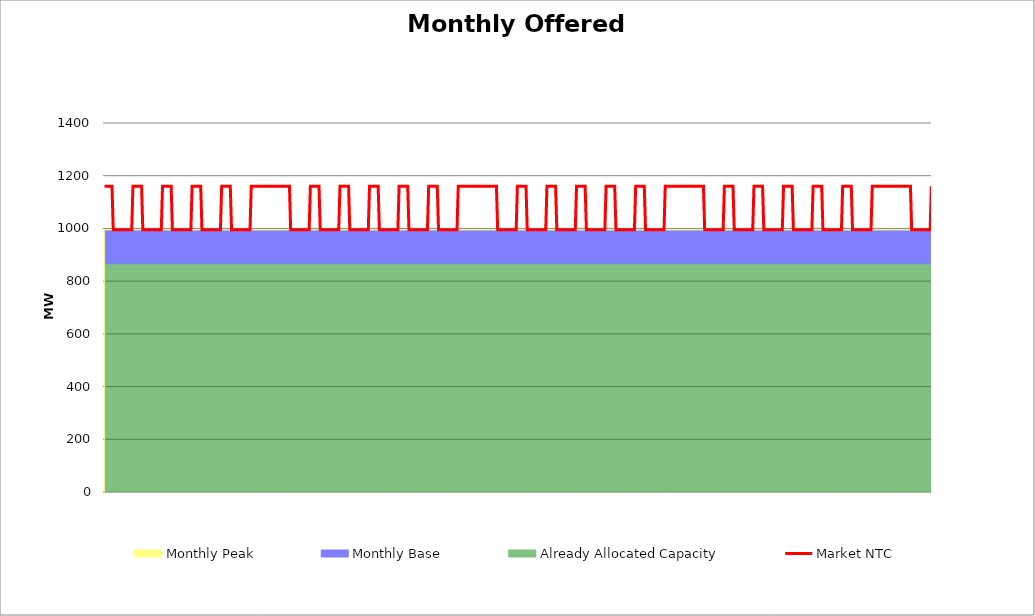
| Category | Market NTC |
|---|---|
| 0 | 1160 |
| 1 | 1160 |
| 2 | 1160 |
| 3 | 1160 |
| 4 | 1160 |
| 5 | 1160 |
| 6 | 1160 |
| 7 | 995 |
| 8 | 995 |
| 9 | 995 |
| 10 | 995 |
| 11 | 995 |
| 12 | 995 |
| 13 | 995 |
| 14 | 995 |
| 15 | 995 |
| 16 | 995 |
| 17 | 995 |
| 18 | 995 |
| 19 | 995 |
| 20 | 995 |
| 21 | 995 |
| 22 | 995 |
| 23 | 1160 |
| 24 | 1160 |
| 25 | 1160 |
| 26 | 1160 |
| 27 | 1160 |
| 28 | 1160 |
| 29 | 1160 |
| 30 | 1160 |
| 31 | 995 |
| 32 | 995 |
| 33 | 995 |
| 34 | 995 |
| 35 | 995 |
| 36 | 995 |
| 37 | 995 |
| 38 | 995 |
| 39 | 995 |
| 40 | 995 |
| 41 | 995 |
| 42 | 995 |
| 43 | 995 |
| 44 | 995 |
| 45 | 995 |
| 46 | 995 |
| 47 | 1160 |
| 48 | 1160 |
| 49 | 1160 |
| 50 | 1160 |
| 51 | 1160 |
| 52 | 1160 |
| 53 | 1160 |
| 54 | 1160 |
| 55 | 995 |
| 56 | 995 |
| 57 | 995 |
| 58 | 995 |
| 59 | 995 |
| 60 | 995 |
| 61 | 995 |
| 62 | 995 |
| 63 | 995 |
| 64 | 995 |
| 65 | 995 |
| 66 | 995 |
| 67 | 995 |
| 68 | 995 |
| 69 | 995 |
| 70 | 995 |
| 71 | 1160 |
| 72 | 1160 |
| 73 | 1160 |
| 74 | 1160 |
| 75 | 1160 |
| 76 | 1160 |
| 77 | 1160 |
| 78 | 1160 |
| 79 | 995 |
| 80 | 995 |
| 81 | 995 |
| 82 | 995 |
| 83 | 995 |
| 84 | 995 |
| 85 | 995 |
| 86 | 995 |
| 87 | 995 |
| 88 | 995 |
| 89 | 995 |
| 90 | 995 |
| 91 | 995 |
| 92 | 995 |
| 93 | 995 |
| 94 | 995 |
| 95 | 1160 |
| 96 | 1160 |
| 97 | 1160 |
| 98 | 1160 |
| 99 | 1160 |
| 100 | 1160 |
| 101 | 1160 |
| 102 | 1160 |
| 103 | 995 |
| 104 | 995 |
| 105 | 995 |
| 106 | 995 |
| 107 | 995 |
| 108 | 995 |
| 109 | 995 |
| 110 | 995 |
| 111 | 995 |
| 112 | 995 |
| 113 | 995 |
| 114 | 995 |
| 115 | 995 |
| 116 | 995 |
| 117 | 995 |
| 118 | 995 |
| 119 | 1160 |
| 120 | 1160 |
| 121 | 1160 |
| 122 | 1160 |
| 123 | 1160 |
| 124 | 1160 |
| 125 | 1160 |
| 126 | 1160 |
| 127 | 1160 |
| 128 | 1160 |
| 129 | 1160 |
| 130 | 1160 |
| 131 | 1160 |
| 132 | 1160 |
| 133 | 1160 |
| 134 | 1160 |
| 135 | 1160 |
| 136 | 1160 |
| 137 | 1160 |
| 138 | 1160 |
| 139 | 1160 |
| 140 | 1160 |
| 141 | 1160 |
| 142 | 1160 |
| 143 | 1160 |
| 144 | 1160 |
| 145 | 1160 |
| 146 | 1160 |
| 147 | 1160 |
| 148 | 1160 |
| 149 | 1160 |
| 150 | 1160 |
| 151 | 995 |
| 152 | 995 |
| 153 | 995 |
| 154 | 995 |
| 155 | 995 |
| 156 | 995 |
| 157 | 995 |
| 158 | 995 |
| 159 | 995 |
| 160 | 995 |
| 161 | 995 |
| 162 | 995 |
| 163 | 995 |
| 164 | 995 |
| 165 | 995 |
| 166 | 995 |
| 167 | 1160 |
| 168 | 1160 |
| 169 | 1160 |
| 170 | 1160 |
| 171 | 1160 |
| 172 | 1160 |
| 173 | 1160 |
| 174 | 1160 |
| 175 | 995 |
| 176 | 995 |
| 177 | 995 |
| 178 | 995 |
| 179 | 995 |
| 180 | 995 |
| 181 | 995 |
| 182 | 995 |
| 183 | 995 |
| 184 | 995 |
| 185 | 995 |
| 186 | 995 |
| 187 | 995 |
| 188 | 995 |
| 189 | 995 |
| 190 | 995 |
| 191 | 1160 |
| 192 | 1160 |
| 193 | 1160 |
| 194 | 1160 |
| 195 | 1160 |
| 196 | 1160 |
| 197 | 1160 |
| 198 | 1160 |
| 199 | 995 |
| 200 | 995 |
| 201 | 995 |
| 202 | 995 |
| 203 | 995 |
| 204 | 995 |
| 205 | 995 |
| 206 | 995 |
| 207 | 995 |
| 208 | 995 |
| 209 | 995 |
| 210 | 995 |
| 211 | 995 |
| 212 | 995 |
| 213 | 995 |
| 214 | 995 |
| 215 | 1160 |
| 216 | 1160 |
| 217 | 1160 |
| 218 | 1160 |
| 219 | 1160 |
| 220 | 1160 |
| 221 | 1160 |
| 222 | 1160 |
| 223 | 995 |
| 224 | 995 |
| 225 | 995 |
| 226 | 995 |
| 227 | 995 |
| 228 | 995 |
| 229 | 995 |
| 230 | 995 |
| 231 | 995 |
| 232 | 995 |
| 233 | 995 |
| 234 | 995 |
| 235 | 995 |
| 236 | 995 |
| 237 | 995 |
| 238 | 995 |
| 239 | 1160 |
| 240 | 1160 |
| 241 | 1160 |
| 242 | 1160 |
| 243 | 1160 |
| 244 | 1160 |
| 245 | 1160 |
| 246 | 1160 |
| 247 | 995 |
| 248 | 995 |
| 249 | 995 |
| 250 | 995 |
| 251 | 995 |
| 252 | 995 |
| 253 | 995 |
| 254 | 995 |
| 255 | 995 |
| 256 | 995 |
| 257 | 995 |
| 258 | 995 |
| 259 | 995 |
| 260 | 995 |
| 261 | 995 |
| 262 | 995 |
| 263 | 1160 |
| 264 | 1160 |
| 265 | 1160 |
| 266 | 1160 |
| 267 | 1160 |
| 268 | 1160 |
| 269 | 1160 |
| 270 | 1160 |
| 271 | 995 |
| 272 | 995 |
| 273 | 995 |
| 274 | 995 |
| 275 | 995 |
| 276 | 995 |
| 277 | 995 |
| 278 | 995 |
| 279 | 995 |
| 280 | 995 |
| 281 | 995 |
| 282 | 995 |
| 283 | 995 |
| 284 | 995 |
| 285 | 995 |
| 286 | 995 |
| 287 | 1160 |
| 288 | 1160 |
| 289 | 1160 |
| 290 | 1160 |
| 291 | 1160 |
| 292 | 1160 |
| 293 | 1160 |
| 294 | 1160 |
| 295 | 1160 |
| 296 | 1160 |
| 297 | 1160 |
| 298 | 1160 |
| 299 | 1160 |
| 300 | 1160 |
| 301 | 1160 |
| 302 | 1160 |
| 303 | 1160 |
| 304 | 1160 |
| 305 | 1160 |
| 306 | 1160 |
| 307 | 1160 |
| 308 | 1160 |
| 309 | 1160 |
| 310 | 1160 |
| 311 | 1160 |
| 312 | 1160 |
| 313 | 1160 |
| 314 | 1160 |
| 315 | 1160 |
| 316 | 1160 |
| 317 | 1160 |
| 318 | 1160 |
| 319 | 995 |
| 320 | 995 |
| 321 | 995 |
| 322 | 995 |
| 323 | 995 |
| 324 | 995 |
| 325 | 995 |
| 326 | 995 |
| 327 | 995 |
| 328 | 995 |
| 329 | 995 |
| 330 | 995 |
| 331 | 995 |
| 332 | 995 |
| 333 | 995 |
| 334 | 995 |
| 335 | 1160 |
| 336 | 1160 |
| 337 | 1160 |
| 338 | 1160 |
| 339 | 1160 |
| 340 | 1160 |
| 341 | 1160 |
| 342 | 1160 |
| 343 | 995 |
| 344 | 995 |
| 345 | 995 |
| 346 | 995 |
| 347 | 995 |
| 348 | 995 |
| 349 | 995 |
| 350 | 995 |
| 351 | 995 |
| 352 | 995 |
| 353 | 995 |
| 354 | 995 |
| 355 | 995 |
| 356 | 995 |
| 357 | 995 |
| 358 | 995 |
| 359 | 1160 |
| 360 | 1160 |
| 361 | 1160 |
| 362 | 1160 |
| 363 | 1160 |
| 364 | 1160 |
| 365 | 1160 |
| 366 | 1160 |
| 367 | 995 |
| 368 | 995 |
| 369 | 995 |
| 370 | 995 |
| 371 | 995 |
| 372 | 995 |
| 373 | 995 |
| 374 | 995 |
| 375 | 995 |
| 376 | 995 |
| 377 | 995 |
| 378 | 995 |
| 379 | 995 |
| 380 | 995 |
| 381 | 995 |
| 382 | 995 |
| 383 | 1160 |
| 384 | 1160 |
| 385 | 1160 |
| 386 | 1160 |
| 387 | 1160 |
| 388 | 1160 |
| 389 | 1160 |
| 390 | 1160 |
| 391 | 995 |
| 392 | 995 |
| 393 | 995 |
| 394 | 995 |
| 395 | 995 |
| 396 | 995 |
| 397 | 995 |
| 398 | 995 |
| 399 | 995 |
| 400 | 995 |
| 401 | 995 |
| 402 | 995 |
| 403 | 995 |
| 404 | 995 |
| 405 | 995 |
| 406 | 995 |
| 407 | 1160 |
| 408 | 1160 |
| 409 | 1160 |
| 410 | 1160 |
| 411 | 1160 |
| 412 | 1160 |
| 413 | 1160 |
| 414 | 1160 |
| 415 | 995 |
| 416 | 995 |
| 417 | 995 |
| 418 | 995 |
| 419 | 995 |
| 420 | 995 |
| 421 | 995 |
| 422 | 995 |
| 423 | 995 |
| 424 | 995 |
| 425 | 995 |
| 426 | 995 |
| 427 | 995 |
| 428 | 995 |
| 429 | 995 |
| 430 | 995 |
| 431 | 1160 |
| 432 | 1160 |
| 433 | 1160 |
| 434 | 1160 |
| 435 | 1160 |
| 436 | 1160 |
| 437 | 1160 |
| 438 | 1160 |
| 439 | 995 |
| 440 | 995 |
| 441 | 995 |
| 442 | 995 |
| 443 | 995 |
| 444 | 995 |
| 445 | 995 |
| 446 | 995 |
| 447 | 995 |
| 448 | 995 |
| 449 | 995 |
| 450 | 995 |
| 451 | 995 |
| 452 | 995 |
| 453 | 995 |
| 454 | 995 |
| 455 | 1160 |
| 456 | 1160 |
| 457 | 1160 |
| 458 | 1160 |
| 459 | 1160 |
| 460 | 1160 |
| 461 | 1160 |
| 462 | 1160 |
| 463 | 1160 |
| 464 | 1160 |
| 465 | 1160 |
| 466 | 1160 |
| 467 | 1160 |
| 468 | 1160 |
| 469 | 1160 |
| 470 | 1160 |
| 471 | 1160 |
| 472 | 1160 |
| 473 | 1160 |
| 474 | 1160 |
| 475 | 1160 |
| 476 | 1160 |
| 477 | 1160 |
| 478 | 1160 |
| 479 | 1160 |
| 480 | 1160 |
| 481 | 1160 |
| 482 | 1160 |
| 483 | 1160 |
| 484 | 1160 |
| 485 | 1160 |
| 486 | 1160 |
| 487 | 995 |
| 488 | 995 |
| 489 | 995 |
| 490 | 995 |
| 491 | 995 |
| 492 | 995 |
| 493 | 995 |
| 494 | 995 |
| 495 | 995 |
| 496 | 995 |
| 497 | 995 |
| 498 | 995 |
| 499 | 995 |
| 500 | 995 |
| 501 | 995 |
| 502 | 995 |
| 503 | 1160 |
| 504 | 1160 |
| 505 | 1160 |
| 506 | 1160 |
| 507 | 1160 |
| 508 | 1160 |
| 509 | 1160 |
| 510 | 1160 |
| 511 | 995 |
| 512 | 995 |
| 513 | 995 |
| 514 | 995 |
| 515 | 995 |
| 516 | 995 |
| 517 | 995 |
| 518 | 995 |
| 519 | 995 |
| 520 | 995 |
| 521 | 995 |
| 522 | 995 |
| 523 | 995 |
| 524 | 995 |
| 525 | 995 |
| 526 | 995 |
| 527 | 1160 |
| 528 | 1160 |
| 529 | 1160 |
| 530 | 1160 |
| 531 | 1160 |
| 532 | 1160 |
| 533 | 1160 |
| 534 | 1160 |
| 535 | 995 |
| 536 | 995 |
| 537 | 995 |
| 538 | 995 |
| 539 | 995 |
| 540 | 995 |
| 541 | 995 |
| 542 | 995 |
| 543 | 995 |
| 544 | 995 |
| 545 | 995 |
| 546 | 995 |
| 547 | 995 |
| 548 | 995 |
| 549 | 995 |
| 550 | 995 |
| 551 | 1160 |
| 552 | 1160 |
| 553 | 1160 |
| 554 | 1160 |
| 555 | 1160 |
| 556 | 1160 |
| 557 | 1160 |
| 558 | 1160 |
| 559 | 995 |
| 560 | 995 |
| 561 | 995 |
| 562 | 995 |
| 563 | 995 |
| 564 | 995 |
| 565 | 995 |
| 566 | 995 |
| 567 | 995 |
| 568 | 995 |
| 569 | 995 |
| 570 | 995 |
| 571 | 995 |
| 572 | 995 |
| 573 | 995 |
| 574 | 995 |
| 575 | 1160 |
| 576 | 1160 |
| 577 | 1160 |
| 578 | 1160 |
| 579 | 1160 |
| 580 | 1160 |
| 581 | 1160 |
| 582 | 1160 |
| 583 | 995 |
| 584 | 995 |
| 585 | 995 |
| 586 | 995 |
| 587 | 995 |
| 588 | 995 |
| 589 | 995 |
| 590 | 995 |
| 591 | 995 |
| 592 | 995 |
| 593 | 995 |
| 594 | 995 |
| 595 | 995 |
| 596 | 995 |
| 597 | 995 |
| 598 | 995 |
| 599 | 1160 |
| 600 | 1160 |
| 601 | 1160 |
| 602 | 1160 |
| 603 | 1160 |
| 604 | 1160 |
| 605 | 1160 |
| 606 | 1160 |
| 607 | 995 |
| 608 | 995 |
| 609 | 995 |
| 610 | 995 |
| 611 | 995 |
| 612 | 995 |
| 613 | 995 |
| 614 | 995 |
| 615 | 995 |
| 616 | 995 |
| 617 | 995 |
| 618 | 995 |
| 619 | 995 |
| 620 | 995 |
| 621 | 995 |
| 622 | 995 |
| 623 | 1160 |
| 624 | 1160 |
| 625 | 1160 |
| 626 | 1160 |
| 627 | 1160 |
| 628 | 1160 |
| 629 | 1160 |
| 630 | 1160 |
| 631 | 1160 |
| 632 | 1160 |
| 633 | 1160 |
| 634 | 1160 |
| 635 | 1160 |
| 636 | 1160 |
| 637 | 1160 |
| 638 | 1160 |
| 639 | 1160 |
| 640 | 1160 |
| 641 | 1160 |
| 642 | 1160 |
| 643 | 1160 |
| 644 | 1160 |
| 645 | 1160 |
| 646 | 1160 |
| 647 | 1160 |
| 648 | 1160 |
| 649 | 1160 |
| 650 | 1160 |
| 651 | 1160 |
| 652 | 1160 |
| 653 | 1160 |
| 654 | 1160 |
| 655 | 995 |
| 656 | 995 |
| 657 | 995 |
| 658 | 995 |
| 659 | 995 |
| 660 | 995 |
| 661 | 995 |
| 662 | 995 |
| 663 | 995 |
| 664 | 995 |
| 665 | 995 |
| 666 | 995 |
| 667 | 995 |
| 668 | 995 |
| 669 | 995 |
| 670 | 995 |
| 671 | 1160 |